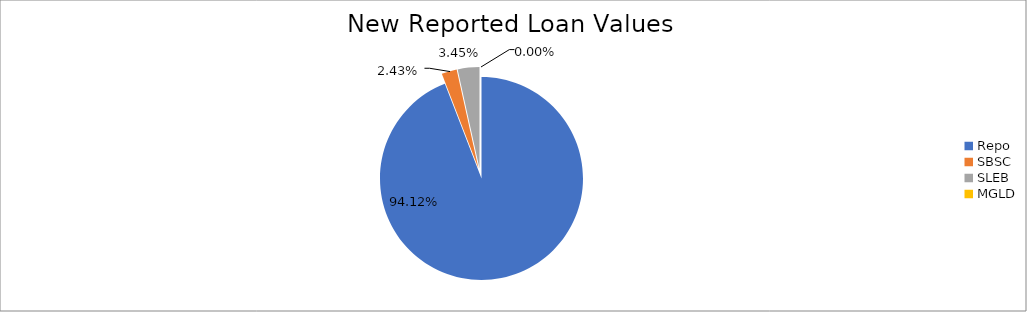
| Category | Series 0 |
|---|---|
| Repo | 8372193.327 |
| SBSC | 215842.875 |
| SLEB | 307252.227 |
| MGLD | 34.207 |